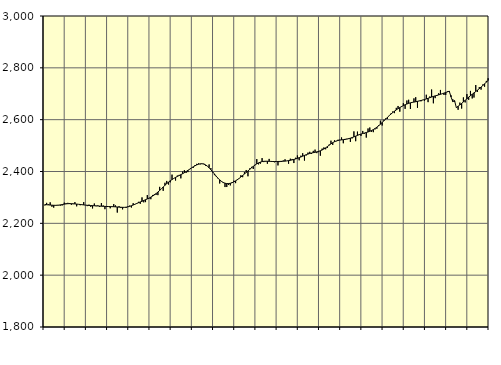
| Category | Piggar | Series 1 |
|---|---|---|
| nan | 2268.7 | 2272.54 |
| 1.0 | 2279 | 2271.78 |
| 1.0 | 2273.5 | 2271.15 |
| 1.0 | 2281 | 2270.57 |
| 1.0 | 2264 | 2270.02 |
| 1.0 | 2260.6 | 2269.6 |
| 1.0 | 2268.4 | 2269.51 |
| 1.0 | 2271 | 2269.7 |
| 1.0 | 2269.4 | 2270.38 |
| 1.0 | 2268.1 | 2271.44 |
| 1.0 | 2269.5 | 2272.73 |
| 1.0 | 2279.8 | 2274.01 |
| nan | 2277.8 | 2275.05 |
| 2.0 | 2279 | 2275.75 |
| 2.0 | 2278.4 | 2276 |
| 2.0 | 2271.7 | 2275.85 |
| 2.0 | 2274.1 | 2275.47 |
| 2.0 | 2281.9 | 2274.93 |
| 2.0 | 2265.6 | 2274.28 |
| 2.0 | 2273.3 | 2273.53 |
| 2.0 | 2269.8 | 2272.74 |
| 2.0 | 2271.6 | 2271.92 |
| 2.0 | 2281.9 | 2271.09 |
| 2.0 | 2270.6 | 2270.33 |
| nan | 2266.4 | 2269.64 |
| 3.0 | 2272.1 | 2269.05 |
| 3.0 | 2263.6 | 2268.6 |
| 3.0 | 2257.5 | 2268.25 |
| 3.0 | 2276.5 | 2267.9 |
| 3.0 | 2266.1 | 2267.48 |
| 3.0 | 2269.2 | 2267 |
| 3.0 | 2263.5 | 2266.52 |
| 3.0 | 2278.2 | 2266.05 |
| 3.0 | 2268.9 | 2265.66 |
| 3.0 | 2254.6 | 2265.32 |
| 3.0 | 2263 | 2265.02 |
| nan | 2263.6 | 2264.79 |
| 4.0 | 2258 | 2264.57 |
| 4.0 | 2263.8 | 2264.34 |
| 4.0 | 2274.2 | 2264.06 |
| 4.0 | 2269 | 2263.67 |
| 4.0 | 2241.5 | 2263.13 |
| 4.0 | 2266 | 2262.54 |
| 4.0 | 2259 | 2262.04 |
| 4.0 | 2253.9 | 2261.7 |
| 4.0 | 2261.2 | 2261.69 |
| 4.0 | 2259.3 | 2262.3 |
| 4.0 | 2265.3 | 2263.55 |
| nan | 2268.4 | 2265.41 |
| 5.0 | 2261 | 2267.84 |
| 5.0 | 2277.7 | 2270.65 |
| 5.0 | 2273.3 | 2273.62 |
| 5.0 | 2277.8 | 2276.58 |
| 5.0 | 2282.9 | 2279.56 |
| 5.0 | 2275.3 | 2282.45 |
| 5.0 | 2300.1 | 2285.24 |
| 5.0 | 2281 | 2288.11 |
| 5.0 | 2281.8 | 2291.06 |
| 5.0 | 2309.1 | 2294.1 |
| 5.0 | 2295.4 | 2297.39 |
| nan | 2293.1 | 2301.07 |
| 6.0 | 2309.4 | 2305.17 |
| 6.0 | 2312.9 | 2309.77 |
| 6.0 | 2310 | 2314.94 |
| 6.0 | 2308.8 | 2320.69 |
| 6.0 | 2340.7 | 2326.92 |
| 6.0 | 2333.2 | 2333.53 |
| 6.0 | 2325.4 | 2340.28 |
| 6.0 | 2356.5 | 2346.84 |
| 6.0 | 2363.6 | 2353.11 |
| 6.0 | 2349.7 | 2358.94 |
| 6.0 | 2358.2 | 2364.21 |
| nan | 2387.9 | 2368.99 |
| 7.0 | 2373.7 | 2373.31 |
| 7.0 | 2365.1 | 2377.2 |
| 7.0 | 2384.3 | 2380.8 |
| 7.0 | 2386.8 | 2384.3 |
| 7.0 | 2373.5 | 2387.82 |
| 7.0 | 2399.7 | 2391.49 |
| 7.0 | 2405.1 | 2395.47 |
| 7.0 | 2394.7 | 2399.8 |
| 7.0 | 2397.6 | 2404.35 |
| 7.0 | 2407.9 | 2409 |
| 7.0 | 2413.2 | 2413.63 |
| nan | 2413.9 | 2418.02 |
| 8.0 | 2425 | 2421.99 |
| 8.0 | 2429.5 | 2425.43 |
| 8.0 | 2431.2 | 2428.1 |
| 8.0 | 2427.6 | 2429.7 |
| 8.0 | 2429.2 | 2429.96 |
| 8.0 | 2430.1 | 2428.63 |
| 8.0 | 2422.3 | 2425.5 |
| 8.0 | 2421.1 | 2420.62 |
| 8.0 | 2427.3 | 2414.31 |
| 8.0 | 2413.2 | 2406.92 |
| 8.0 | 2396.6 | 2398.81 |
| nan | 2385.9 | 2390.39 |
| 9.0 | 2380.7 | 2382.12 |
| 9.0 | 2373.2 | 2374.38 |
| 9.0 | 2353.8 | 2367.55 |
| 9.0 | 2360.8 | 2361.89 |
| 9.0 | 2355.4 | 2357.64 |
| 9.0 | 2340 | 2354.82 |
| 9.0 | 2340.1 | 2353.39 |
| 9.0 | 2348 | 2353.35 |
| 9.0 | 2346.3 | 2354.52 |
| 9.0 | 2359.1 | 2356.71 |
| 9.0 | 2364.5 | 2359.84 |
| nan | 2355.1 | 2363.81 |
| 10.0 | 2370.4 | 2368.35 |
| 10.0 | 2373.9 | 2373.35 |
| 10.0 | 2385.7 | 2378.78 |
| 10.0 | 2378 | 2384.47 |
| 10.0 | 2397.6 | 2390.29 |
| 10.0 | 2405.8 | 2396.22 |
| 10.0 | 2381.5 | 2402.22 |
| 10.0 | 2411.8 | 2408.21 |
| 10.0 | 2417.8 | 2414.11 |
| 10.0 | 2409.7 | 2419.73 |
| 10.0 | 2425.8 | 2424.89 |
| nan | 2447.9 | 2429.45 |
| 11.0 | 2427.5 | 2433.25 |
| 11.0 | 2430 | 2436.17 |
| 11.0 | 2451.7 | 2438.18 |
| 11.0 | 2436.3 | 2439.32 |
| 11.0 | 2438.2 | 2439.72 |
| 11.0 | 2429.8 | 2439.55 |
| 11.0 | 2448.6 | 2439.19 |
| 11.0 | 2438.3 | 2438.84 |
| 11.0 | 2436.6 | 2438.54 |
| 11.0 | 2435.5 | 2438.44 |
| 11.0 | 2437.9 | 2438.54 |
| nan | 2423.5 | 2438.66 |
| 12.0 | 2436.3 | 2438.86 |
| 12.0 | 2436.6 | 2439.18 |
| 12.0 | 2442.6 | 2439.55 |
| 12.0 | 2447.1 | 2440.07 |
| 12.0 | 2441.1 | 2440.89 |
| 12.0 | 2429.9 | 2441.98 |
| 12.0 | 2449.4 | 2443.28 |
| 12.0 | 2448.3 | 2444.78 |
| 12.0 | 2432.6 | 2446.52 |
| 12.0 | 2453 | 2448.49 |
| 12.0 | 2461.9 | 2450.74 |
| nan | 2443.2 | 2453.26 |
| 13.0 | 2461.1 | 2456.11 |
| 13.0 | 2470.6 | 2459.13 |
| 13.0 | 2442.1 | 2462.08 |
| 13.0 | 2461.9 | 2464.82 |
| 13.0 | 2472.9 | 2467.27 |
| 13.0 | 2476 | 2469.42 |
| 13.0 | 2467.6 | 2471.21 |
| 13.0 | 2479.6 | 2472.73 |
| 13.0 | 2484.4 | 2474.17 |
| 13.0 | 2470.9 | 2475.75 |
| 13.0 | 2475 | 2477.61 |
| nan | 2461 | 2479.96 |
| 14.0 | 2488.3 | 2482.97 |
| 14.0 | 2492.8 | 2486.72 |
| 14.0 | 2485.7 | 2491.22 |
| 14.0 | 2491.1 | 2496.3 |
| 14.0 | 2504 | 2501.53 |
| 14.0 | 2518.9 | 2506.59 |
| 14.0 | 2502.5 | 2511.18 |
| 14.0 | 2520.3 | 2514.94 |
| 14.0 | 2516.8 | 2517.8 |
| 14.0 | 2522.6 | 2519.79 |
| 14.0 | 2522.7 | 2521.12 |
| nan | 2531.4 | 2522.08 |
| 15.0 | 2509 | 2522.88 |
| 15.0 | 2525.8 | 2523.72 |
| 15.0 | 2526.4 | 2524.93 |
| 15.0 | 2528.4 | 2526.62 |
| 15.0 | 2514.1 | 2528.66 |
| 15.0 | 2527.8 | 2530.98 |
| 15.0 | 2554.8 | 2533.59 |
| 15.0 | 2516.9 | 2536.43 |
| 15.0 | 2553.9 | 2539.3 |
| 15.0 | 2544 | 2542.04 |
| 15.0 | 2537.4 | 2544.45 |
| nan | 2556.5 | 2546.58 |
| 16.0 | 2546 | 2548.53 |
| 16.0 | 2530.8 | 2550.48 |
| 16.0 | 2566 | 2552.6 |
| 16.0 | 2569.8 | 2555.09 |
| 16.0 | 2553.1 | 2558.13 |
| 16.0 | 2551.8 | 2561.8 |
| 16.0 | 2562.6 | 2566.1 |
| 16.0 | 2565.1 | 2570.99 |
| 16.0 | 2579.2 | 2576.45 |
| 16.0 | 2596.2 | 2582.4 |
| 16.0 | 2577.4 | 2588.82 |
| nan | 2599.6 | 2595.53 |
| 17.0 | 2604.7 | 2602.38 |
| 17.0 | 2603 | 2609.18 |
| 17.0 | 2616.1 | 2615.66 |
| 17.0 | 2623.8 | 2621.72 |
| 17.0 | 2631.7 | 2627.44 |
| 17.0 | 2625.2 | 2632.83 |
| 17.0 | 2645.6 | 2637.78 |
| 17.0 | 2652.8 | 2642.41 |
| 17.0 | 2630.8 | 2646.72 |
| 17.0 | 2648.8 | 2650.68 |
| 17.0 | 2663.5 | 2654.29 |
| nan | 2641.7 | 2657.59 |
| 18.0 | 2674 | 2660.42 |
| 18.0 | 2676.8 | 2662.87 |
| 18.0 | 2641.3 | 2664.96 |
| 18.0 | 2665.8 | 2666.56 |
| 18.0 | 2682.1 | 2667.91 |
| 18.0 | 2686.7 | 2669.25 |
| 18.0 | 2645.7 | 2670.69 |
| 18.0 | 2673.1 | 2672.23 |
| 18.0 | 2670.9 | 2673.87 |
| 18.0 | 2676.4 | 2675.71 |
| 18.0 | 2672.1 | 2677.74 |
| nan | 2696.2 | 2679.99 |
| 19.0 | 2667.6 | 2682.43 |
| 19.0 | 2689.4 | 2684.89 |
| 19.0 | 2716.3 | 2687.33 |
| 19.0 | 2663.2 | 2689.68 |
| 19.0 | 2683 | 2691.79 |
| 19.0 | 2691.6 | 2693.7 |
| 19.0 | 2701.9 | 2695.67 |
| 19.0 | 2714.7 | 2697.82 |
| 19.0 | 2700.3 | 2700.12 |
| 19.0 | 2695.2 | 2702.5 |
| 19.0 | 2695.5 | 2704.95 |
| nan | 2709.5 | 2707.4 |
| 20.0 | 2706.9 | 2709.94 |
| 20.0 | 2693.9 | 2687.56 |
| 20.0 | 2678.8 | 2669.59 |
| 20.0 | 2668.8 | 2673.38 |
| 20.0 | 2647.3 | 2646.46 |
| 20.0 | 2638.2 | 2651.55 |
| 20.0 | 2665.9 | 2656.99 |
| 20.0 | 2642.9 | 2662.69 |
| 20.0 | 2685.9 | 2668.56 |
| 20.0 | 2666.5 | 2674.65 |
| 20.0 | 2698.7 | 2680.82 |
| nan | 2676.5 | 2686.84 |
| 21.0 | 2711 | 2692.6 |
| 21.0 | 2681.9 | 2698.1 |
| 21.0 | 2685.3 | 2703.37 |
| 21.0 | 2733.6 | 2708.6 |
| 21.0 | 2707.2 | 2714 |
| 21.0 | 2725.8 | 2719.66 |
| 21.0 | 2715.9 | 2725.64 |
| 21.0 | 2735.8 | 2731.87 |
| 21.0 | 2727.1 | 2738.29 |
| 21.0 | 2749.6 | 2744.69 |
| 21.0 | 2759.8 | 2751.02 |